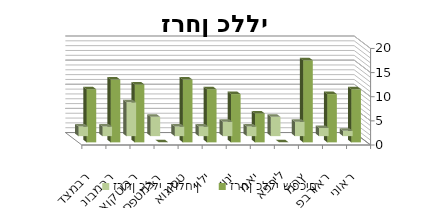
| Category | זרחן כללי קולחין | זרחן כללי שפכים |
|---|---|---|
| ינואר | 1.1 | 11 |
| פברואר | 1.7 | 10 |
| מרץ | 3 | 17 |
| אפריל | 4 | 0 |
| מאי | 2 | 6 |
| יוני | 3 | 10 |
| יולי | 2 | 11 |
| אוגוסט | 2 | 13 |
| ספטמבר | 4 | 0 |
| אוקטובר | 7 | 12 |
| נובמבר | 2 | 13 |
| דצמבר | 2 | 11 |